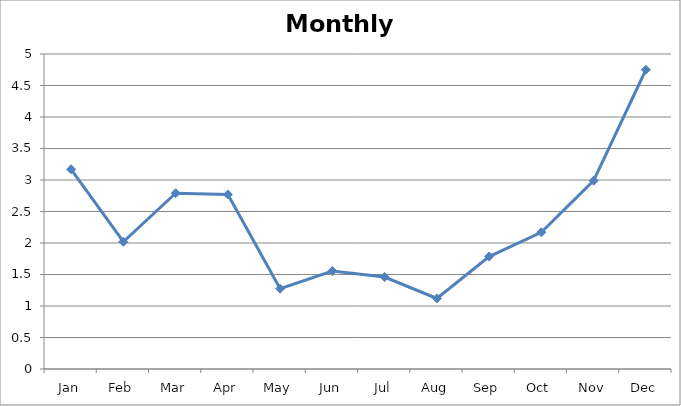
| Category | Series 0 |
|---|---|
| Jan | 3.17 |
| Feb | 2.02 |
| Mar | 2.79 |
| Apr | 2.77 |
| May | 1.275 |
| Jun | 1.555 |
| Jul | 1.46 |
| Aug | 1.12 |
| Sep | 1.785 |
| Oct | 2.17 |
| Nov | 2.99 |
| Dec | 4.75 |